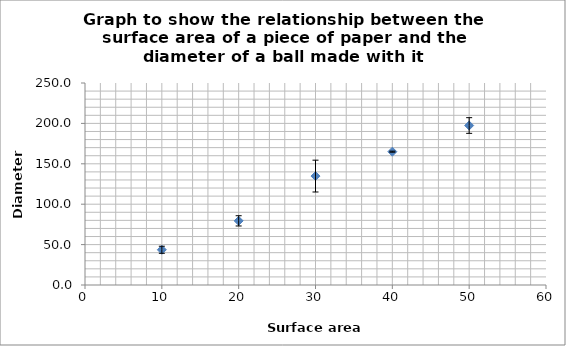
| Category | Series 0 |
|---|---|
| 10.0 | 43.6 |
| 20.0 | 79.4 |
| 30.0 | 134.8 |
| 40.0 | 165 |
| 50.0 | 197.4 |